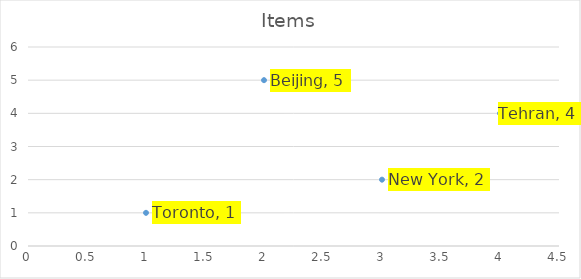
| Category | Items |
|---|---|
| 0 | 1 |
| 1 | 5 |
| 2 | 2 |
| 3 | 4 |